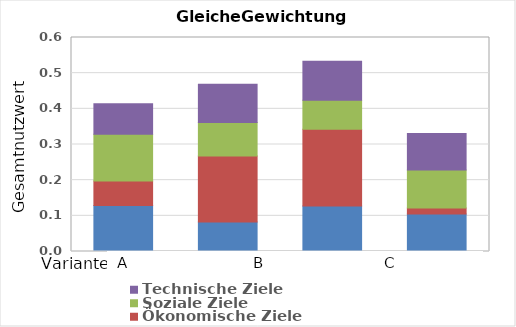
| Category | Umwelt- und Ressourcenschutz | Ökonomische Ziele | Soziale Ziele | Technische Ziele |
|---|---|---|---|---|
| 0 | 0.129 | 0.069 | 0.131 | 0.086 |
| 1 | 0.083 | 0.185 | 0.094 | 0.107 |
| 2 | 0.127 | 0.216 | 0.081 | 0.109 |
| 3 | 0.105 | 0.017 | 0.106 | 0.102 |